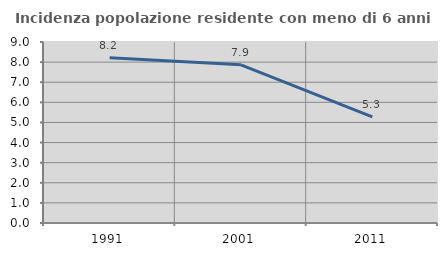
| Category | Incidenza popolazione residente con meno di 6 anni |
|---|---|
| 1991.0 | 8.222 |
| 2001.0 | 7.865 |
| 2011.0 | 5.277 |